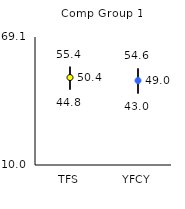
| Category | 25th | 75th | Mean |
|---|---|---|---|
| TFS | 44.8 | 55.4 | 50.39 |
| YFCY | 43 | 54.6 | 48.98 |